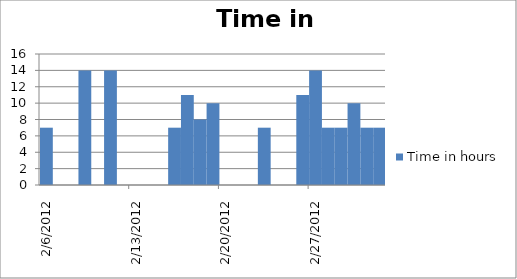
| Category | Time in hours |
|---|---|
| 2/6/12 | 7 |
| 2/9/12 | 14 |
| 2/11/12 | 14 |
| 2/16/12 | 7 |
| 2/17/12 | 11 |
| 2/18/12 | 8 |
| 2/19/12 | 10 |
| 2/23/12 | 7 |
| 2/26/12 | 11 |
| 2/27/12 | 14 |
| 2/28/12 | 7 |
| 2/29/12 | 7 |
| 3/1/12 | 10 |
| 3/2/12 | 7 |
| 3/3/12 | 7 |